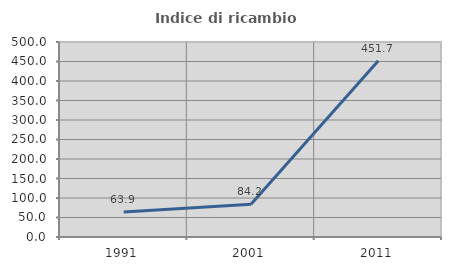
| Category | Indice di ricambio occupazionale  |
|---|---|
| 1991.0 | 63.889 |
| 2001.0 | 84.211 |
| 2011.0 | 451.724 |